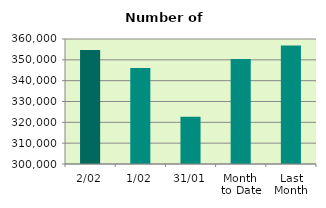
| Category | Series 0 |
|---|---|
| 2/02 | 354720 |
| 1/02 | 346044 |
| 31/01 | 322644 |
| Month 
to Date | 350382 |
| Last
Month | 356827.619 |